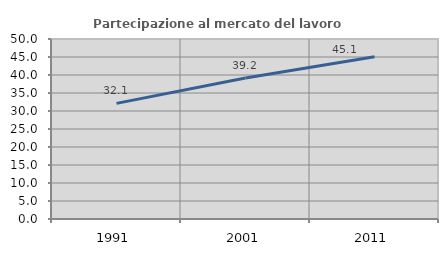
| Category | Partecipazione al mercato del lavoro  femminile |
|---|---|
| 1991.0 | 32.124 |
| 2001.0 | 39.156 |
| 2011.0 | 45.066 |